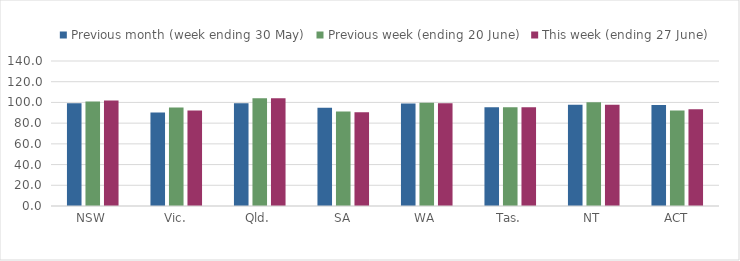
| Category | Previous month (week ending 30 May) | Previous week (ending 20 June) | This week (ending 27 June) |
|---|---|---|---|
| NSW | 99.246 | 100.95 | 101.873 |
| Vic. | 90.368 | 95.149 | 92.147 |
| Qld. | 99.296 | 104.143 | 104.143 |
| SA | 94.788 | 91.31 | 90.482 |
| WA | 98.911 | 99.604 | 99.138 |
| Tas. | 95.423 | 95.423 | 95.423 |
| NT | 97.741 | 100.082 | 97.645 |
| ACT | 97.572 | 92.117 | 93.427 |